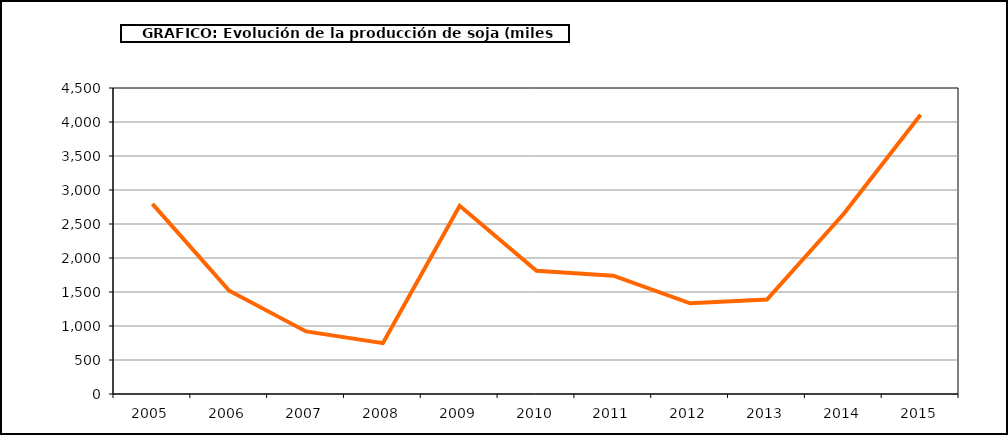
| Category | Producción |
|---|---|
| 2005.0 | 2797 |
| 2006.0 | 1519 |
| 2007.0 | 920 |
| 2008.0 | 748 |
| 2009.0 | 2767 |
| 2010.0 | 1812 |
| 2011.0 | 1740 |
| 2012.0 | 1333 |
| 2013.0 | 1390 |
| 2014.0 | 2650 |
| 2015.0 | 4106 |